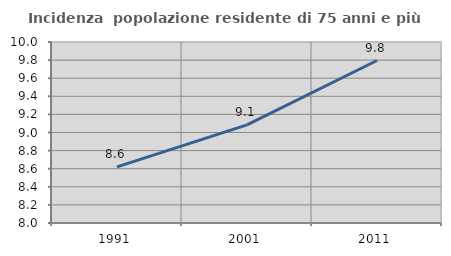
| Category | Incidenza  popolazione residente di 75 anni e più |
|---|---|
| 1991.0 | 8.621 |
| 2001.0 | 9.084 |
| 2011.0 | 9.795 |